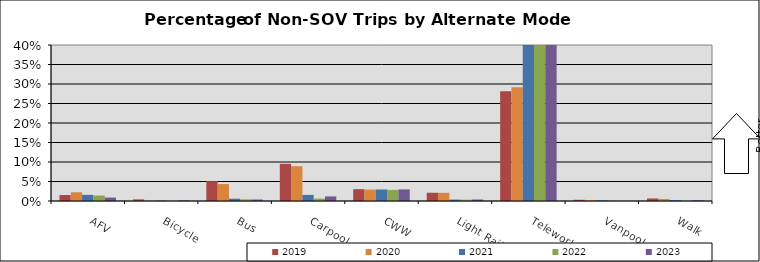
| Category | 2019 | 2020 | 2021 | 2022 | 2023 |
|---|---|---|---|---|---|
| AFV | 0.015 | 0.022 | 0.016 | 0.014 | 0.009 |
| Bicycle | 0.004 | 0.001 | 0.001 | 0 | 0.002 |
| Bus | 0.051 | 0.043 | 0.006 | 0.004 | 0.004 |
| Carpool | 0.095 | 0.089 | 0.016 | 0.006 | 0.012 |
| CWW | 0.03 | 0.029 | 0.03 | 0.028 | 0.03 |
| Light Rail | 0.021 | 0.021 | 0.004 | 0.003 | 0.004 |
| Telework | 0.281 | 0.292 | 0.763 | 0.788 | 0.826 |
| Vanpool | 0.003 | 0.002 | 0.002 | 0.001 | 0 |
| Walk | 0.007 | 0.005 | 0.002 | 0 | 0.002 |